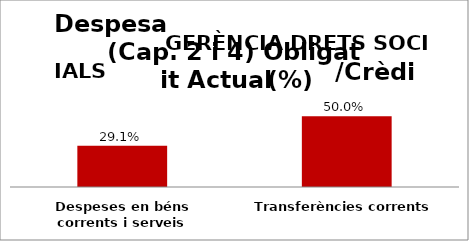
| Category | Series 0 |
|---|---|
| Despeses en béns corrents i serveis | 0.291 |
| Transferències corrents | 0.5 |